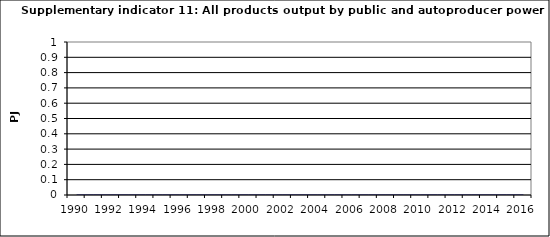
| Category | All products output by public and autoproducer power stations, PJ |
|---|---|
| 1990 | 0 |
| 1991 | 0 |
| 1992 | 0 |
| 1993 | 0 |
| 1994 | 0 |
| 1995 | 0 |
| 1996 | 0 |
| 1997 | 0 |
| 1998 | 0 |
| 1999 | 0 |
| 2000 | 0 |
| 2001 | 0 |
| 2002 | 0 |
| 2003 | 0 |
| 2004 | 0 |
| 2005 | 0 |
| 2006 | 0 |
| 2007 | 0 |
| 2008 | 0 |
| 2009 | 0 |
| 2010 | 0 |
| 2011 | 0 |
| 2012 | 0 |
| 2013 | 0 |
| 2014 | 0 |
| 2015 | 0 |
| 2016 | 0 |